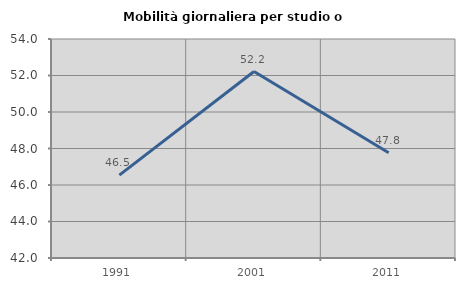
| Category | Mobilità giornaliera per studio o lavoro |
|---|---|
| 1991.0 | 46.543 |
| 2001.0 | 52.216 |
| 2011.0 | 47.769 |